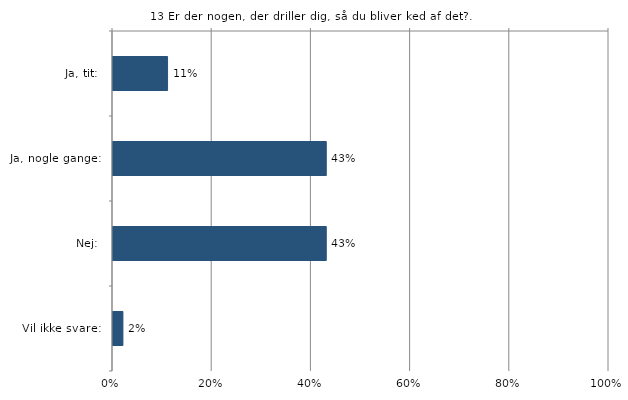
| Category | Er der nogen, der driller dig, så du bliver ked af det? |
|---|---|
| Ja, tit:  | 0.11 |
| Ja, nogle gange:  | 0.43 |
| Nej:  | 0.43 |
| Vil ikke svare:  | 0.02 |